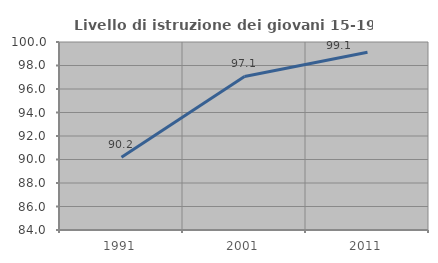
| Category | Livello di istruzione dei giovani 15-19 anni |
|---|---|
| 1991.0 | 90.196 |
| 2001.0 | 97.071 |
| 2011.0 | 99.127 |